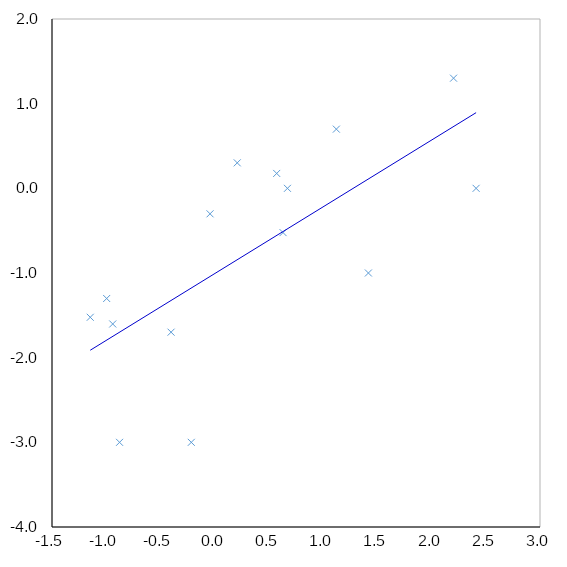
| Category | log10(efficacy) |
|---|---|
| -1.14723941464484 | -1.523 |
| 1.41761490828364 | -1 |
| -0.0426174345156444 | -0.301 |
| 0.208202019969638 | 0.301 |
| -0.877095782207983 | -3 |
| -0.995924585841407 | -1.301 |
| 0.630528753772154 | -0.523 |
| 0.671113704350078 | 0 |
| 2.20276706648128 | 1.301 |
| -0.939997552334821 | -1.602 |
| 1.12210446118604 | 0.699 |
| -0.401999858758505 | -1.699 |
| -0.215618309558578 | -3 |
| 0.572056443678213 | 0.176 |
| 2.41070954325482 | 0 |